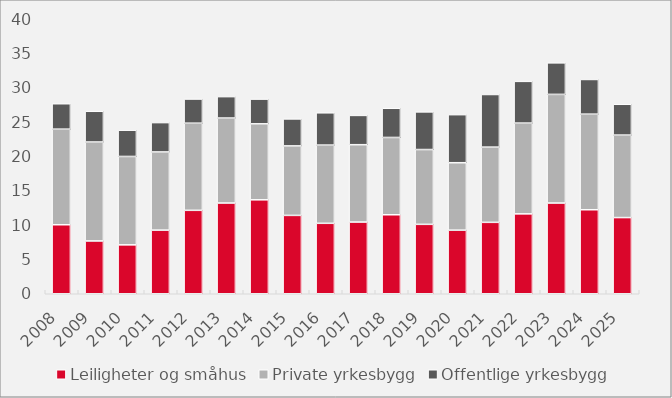
| Category | Leiligheter og småhus | Private yrkesbygg | Offentlige yrkesbygg |
|---|---|---|---|
| 2008.0 | 10.038 | 13.904 | 3.698 |
| 2009.0 | 7.682 | 14.389 | 4.47 |
| 2010.0 | 7.115 | 12.856 | 3.819 |
| 2011.0 | 9.259 | 11.367 | 4.27 |
| 2012.0 | 12.136 | 12.674 | 3.514 |
| 2013.0 | 13.199 | 12.36 | 3.114 |
| 2014.0 | 13.666 | 11.051 | 3.598 |
| 2015.0 | 11.399 | 10.106 | 3.924 |
| 2016.0 | 10.248 | 11.377 | 4.696 |
| 2017.0 | 10.43 | 11.249 | 4.262 |
| 2018.0 | 11.489 | 11.244 | 4.246 |
| 2019.0 | 10.097 | 10.88 | 5.476 |
| 2020.0 | 9.251 | 9.811 | 6.989 |
| 2021.0 | 10.387 | 10.943 | 7.652 |
| 2022.0 | 11.619 | 13.204 | 6.072 |
| 2023.0 | 13.196 | 15.803 | 4.59 |
| 2024.0 | 12.219 | 13.905 | 5.045 |
| 2025.0 | 11.081 | 11.997 | 4.483 |